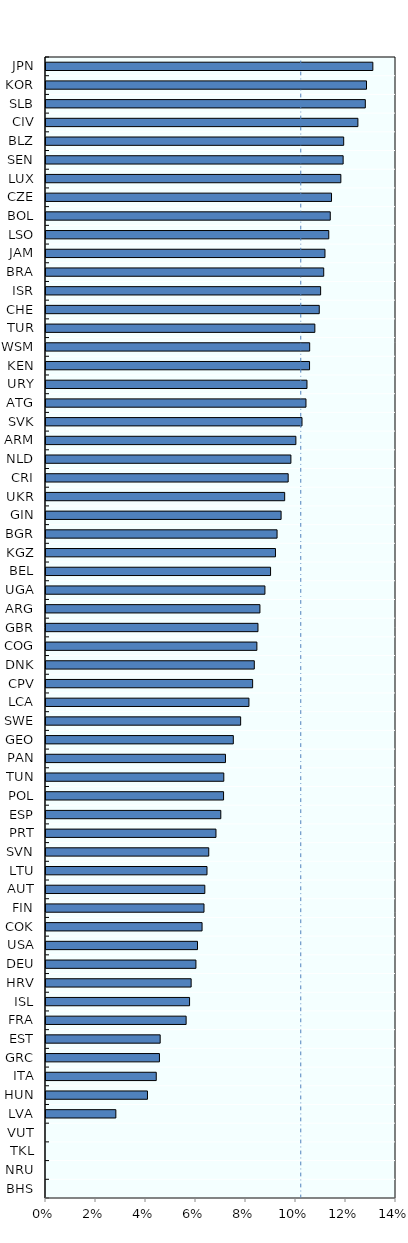
| Category | Series 0 |
|---|---|
| BHS | 0 |
| NRU | 0 |
| TKL | 0 |
| VUT | 0 |
| LVA | 0.028 |
| HUN | 0.041 |
| ITA | 0.044 |
| GRC | 0.045 |
| EST | 0.046 |
| FRA | 0.056 |
| ISL | 0.057 |
| HRV | 0.058 |
| DEU | 0.06 |
| USA | 0.061 |
| COK | 0.062 |
| FIN | 0.063 |
| AUT | 0.064 |
| LTU | 0.064 |
| SVN | 0.065 |
| PRT | 0.068 |
| ESP | 0.07 |
| POL | 0.071 |
| TUN | 0.071 |
| PAN | 0.072 |
| GEO | 0.075 |
| SWE | 0.078 |
| LCA | 0.081 |
| CPV | 0.083 |
| DNK | 0.083 |
| COG | 0.084 |
| GBR | 0.085 |
| ARG | 0.086 |
| UGA | 0.088 |
| BEL | 0.09 |
| KGZ | 0.092 |
| BGR | 0.092 |
| GIN | 0.094 |
| UKR | 0.095 |
| CRI | 0.097 |
| NLD | 0.098 |
| ARM | 0.1 |
| SVK | 0.102 |
| ATG | 0.104 |
| URY | 0.104 |
| KEN | 0.105 |
| WSM | 0.105 |
| TUR | 0.108 |
| CHE | 0.109 |
| ISR | 0.11 |
| BRA | 0.111 |
| JAM | 0.112 |
| LSO | 0.113 |
| BOL | 0.114 |
| CZE | 0.114 |
| LUX | 0.118 |
| SEN | 0.119 |
| BLZ | 0.119 |
| CIV | 0.125 |
| SLB | 0.128 |
| KOR | 0.128 |
| JPN | 0.131 |